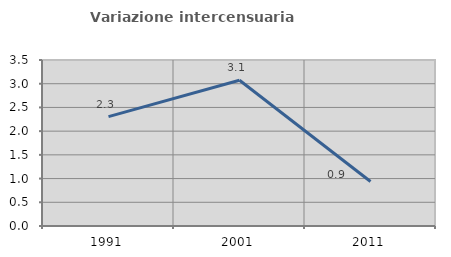
| Category | Variazione intercensuaria annua |
|---|---|
| 1991.0 | 2.306 |
| 2001.0 | 3.072 |
| 2011.0 | 0.938 |